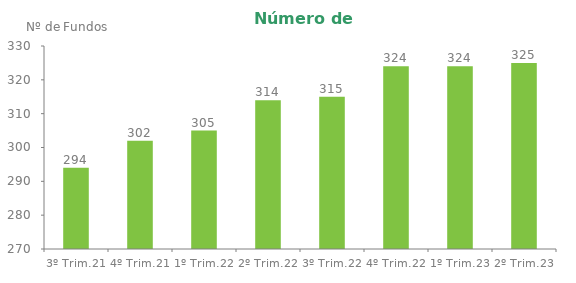
| Category | Series 0 |
|---|---|
| 3º Trim.21 | 294 |
| 4º Trim.21 | 302 |
| 1º Trim.22 | 305 |
| 2º Trim.22 | 314 |
| 3º Trim.22 | 315 |
| 4º Trim.22 | 324 |
| 1º Trim.23 | 324 |
| 2º Trim.23 | 325 |